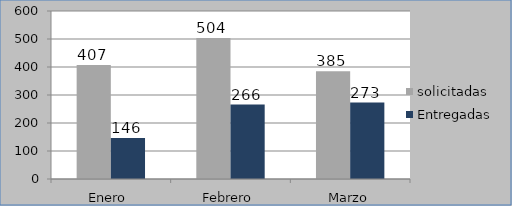
| Category | solicitadas | Entregadas |
|---|---|---|
| Enero  | 407 | 146 |
| Febrero | 504 | 266 |
| Marzo | 385 | 273 |